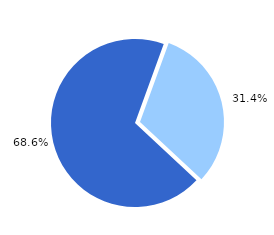
| Category | Series 0 |
|---|---|
| Personen im Alter von 65 und mehr Jahren | 4909 |
| Personen im Alter von 18 bis unter 65 Jahren  | 10734 |